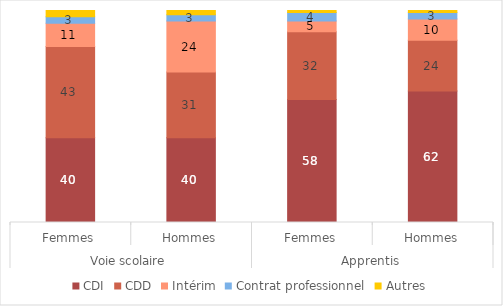
| Category | CDI | CDD | Intérim | Contrat professionnel | Autres |
|---|---|---|---|---|---|
| 0 | 40 | 43 | 11 | 3 | 3 |
| 1 | 40 | 31 | 24 | 3 | 2 |
| 2 | 58 | 32 | 5 | 4 | 1 |
| 3 | 62 | 24 | 10 | 3 | 1 |